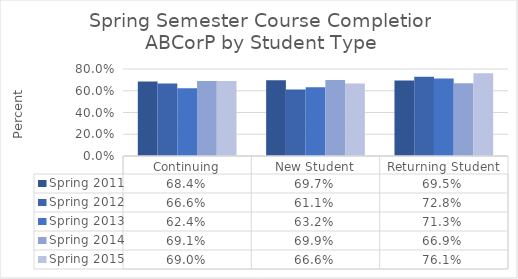
| Category | Spring 2011 | Spring 2012 | Spring 2013 | Spring 2014 | Spring 2015 |
|---|---|---|---|---|---|
| Continuing | 0.684 | 0.666 | 0.624 | 0.691 | 0.69 |
| New Student | 0.697 | 0.611 | 0.632 | 0.699 | 0.666 |
| Returning Student | 0.695 | 0.728 | 0.713 | 0.669 | 0.761 |